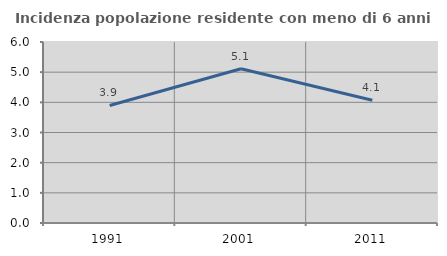
| Category | Incidenza popolazione residente con meno di 6 anni |
|---|---|
| 1991.0 | 3.897 |
| 2001.0 | 5.113 |
| 2011.0 | 4.071 |